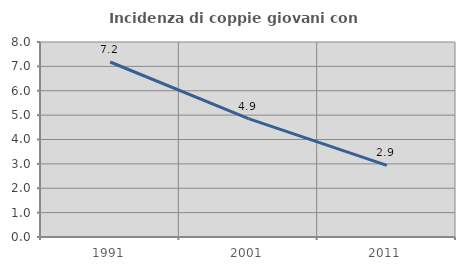
| Category | Incidenza di coppie giovani con figli |
|---|---|
| 1991.0 | 7.179 |
| 2001.0 | 4.854 |
| 2011.0 | 2.941 |